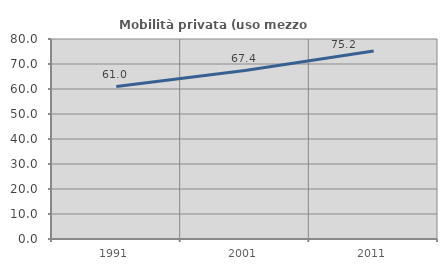
| Category | Mobilità privata (uso mezzo privato) |
|---|---|
| 1991.0 | 60.956 |
| 2001.0 | 67.366 |
| 2011.0 | 75.165 |